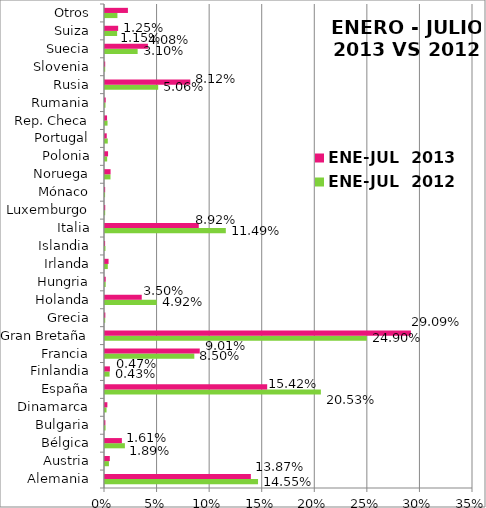
| Category | ENE-JUL  2012 | ENE-JUL  2013 |
|---|---|---|
| Alemania | 0.146 | 0.139 |
| Austria | 0.004 | 0.005 |
| Bélgica | 0.019 | 0.016 |
| Bulgaria | 0.001 | 0 |
| Dinamarca | 0.001 | 0.002 |
| España | 0.205 | 0.154 |
| Finlandia | 0.004 | 0.005 |
| Francia | 0.085 | 0.09 |
| Gran Bretaña | 0.249 | 0.291 |
| Grecia | 0 | 0 |
| Holanda | 0.049 | 0.035 |
| Hungria | 0.001 | 0.001 |
| Irlanda | 0.003 | 0.003 |
| Islandia | 0 | 0 |
| Italia | 0.115 | 0.089 |
| Luxemburgo | 0 | 0 |
| Mónaco | 0 | 0 |
| Noruega | 0.005 | 0.005 |
| Polonia | 0.002 | 0.003 |
| Portugal | 0.003 | 0.002 |
| Rep. Checa | 0.002 | 0.002 |
| Rumania | 0 | 0.001 |
| Rusia | 0.051 | 0.081 |
| Slovenia | 0 | 0 |
| Suecia | 0.031 | 0.041 |
| Suiza | 0.012 | 0.013 |
| Otros | 0.012 | 0.022 |